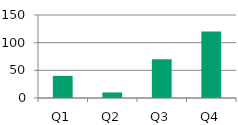
| Category | Series 0 |
|---|---|
| Q1 | 40 |
| Q2 | 10 |
| Q3 | 70 |
| Q4 | 120 |